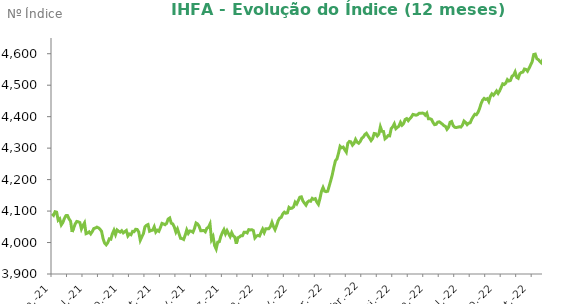
| Category | Series 0 |
|---|---|
| 2021-06-30 | 4091.19 |
| 2021-07-01 | 4086.52 |
| 2021-07-02 | 4097.86 |
| 2021-07-05 | 4096.51 |
| 2021-07-06 | 4070.87 |
| 2021-07-07 | 4075.44 |
| 2021-07-08 | 4056.16 |
| 2021-07-09 | 4063.56 |
| 2021-07-12 | 4076.5 |
| 2021-07-13 | 4085.56 |
| 2021-07-14 | 4085.78 |
| 2021-07-15 | 4075.11 |
| 2021-07-16 | 4067.77 |
| 2021-07-19 | 4033.75 |
| 2021-07-20 | 4046.31 |
| 2021-07-21 | 4059.3 |
| 2021-07-22 | 4066.98 |
| 2021-07-23 | 4065.91 |
| 2021-07-26 | 4063.49 |
| 2021-07-27 | 4043.27 |
| 2021-07-28 | 4054.41 |
| 2021-07-29 | 4062.71 |
| 2021-07-30 | 4028.14 |
| 2021-08-02 | 4030.13 |
| 2021-08-03 | 4033.93 |
| 2021-08-04 | 4027.52 |
| 2021-08-05 | 4034.98 |
| 2021-08-06 | 4044.43 |
| 2021-08-09 | 4046.2 |
| 2021-08-10 | 4048.89 |
| 2021-08-11 | 4046.7 |
| 2021-08-12 | 4042.07 |
| 2021-08-13 | 4035.54 |
| 2021-08-16 | 4012.2 |
| 2021-08-17 | 3997.84 |
| 2021-08-18 | 3992.73 |
| 2021-08-19 | 3999.27 |
| 2021-08-20 | 4011.78 |
| 2021-08-23 | 4010.67 |
| 2021-08-24 | 4028.05 |
| 2021-08-25 | 4039.1 |
| 2021-08-26 | 4025.41 |
| 2021-08-27 | 4040.01 |
| 2021-08-30 | 4035.92 |
| 2021-08-31 | 4033.08 |
| 2021-09-01 | 4037.66 |
| 2021-09-02 | 4030.79 |
| 2021-09-03 | 4034.61 |
| 2021-09-06 | 4038.27 |
| 2021-09-08 | 4020.87 |
| 2021-09-09 | 4027.15 |
| 2021-09-10 | 4024.8 |
| 2021-09-13 | 4035.39 |
| 2021-09-14 | 4034.54 |
| 2021-09-15 | 4042.17 |
| 2021-09-16 | 4041.49 |
| 2021-09-17 | 4033.61 |
| 2021-09-20 | 4007.25 |
| 2021-09-21 | 4018.04 |
| 2021-09-22 | 4027.91 |
| 2021-09-23 | 4049.69 |
| 2021-09-24 | 4054.89 |
| 2021-09-27 | 4057.13 |
| 2021-09-28 | 4035.95 |
| 2021-09-29 | 4038.34 |
| 2021-09-30 | 4039.3 |
| 2021-10-01 | 4050.05 |
| 2021-10-04 | 4033.15 |
| 2021-10-05 | 4038.94 |
| 2021-10-06 | 4035.78 |
| 2021-10-07 | 4047.57 |
| 2021-10-08 | 4060.84 |
| 2021-10-11 | 4059.07 |
| 2021-10-13 | 4056.52 |
| 2021-10-14 | 4061.11 |
| 2021-10-15 | 4074.77 |
| 2021-10-18 | 4078.05 |
| 2021-10-19 | 4061.42 |
| 2021-10-20 | 4059.05 |
| 2021-10-21 | 4048.86 |
| 2021-10-22 | 4033.16 |
| 2021-10-25 | 4043.06 |
| 2021-10-26 | 4027.86 |
| 2021-10-27 | 4013.41 |
| 2021-10-28 | 4012.41 |
| 2021-10-29 | 4009.78 |
| 2021-11-01 | 4023.42 |
| 2021-11-03 | 4040.16 |
| 2021-11-04 | 4029.18 |
| 2021-11-05 | 4036.69 |
| 2021-11-08 | 4035.95 |
| 2021-11-09 | 4032.66 |
| 2021-11-10 | 4045.02 |
| 2021-11-11 | 4062.03 |
| 2021-11-12 | 4059.02 |
| 2021-11-16 | 4051.69 |
| 2021-11-17 | 4037.47 |
| 2021-11-18 | 4037.78 |
| 2021-11-19 | 4038.26 |
| 2021-11-22 | 4034.06 |
| 2021-11-23 | 4045.6 |
| 2021-11-24 | 4048.5 |
| 2021-11-25 | 4058.96 |
| 2021-11-26 | 4008.94 |
| 2021-11-29 | 4018.61 |
| 2021-11-30 | 3990.07 |
| 2021-12-01 | 3979.51 |
| 2021-12-02 | 4001.4 |
| 2021-12-03 | 4002.43 |
| 2021-12-06 | 4019.49 |
| 2021-12-07 | 4031.65 |
| 2021-12-08 | 4040.97 |
| 2021-12-09 | 4027.29 |
| 2021-12-10 | 4037.68 |
| 2021-12-13 | 4028.23 |
| 2021-12-14 | 4019.14 |
| 2021-12-15 | 4031.45 |
| 2021-12-16 | 4021.15 |
| 2021-12-17 | 4017.55 |
| 2021-12-20 | 3996.12 |
| 2021-12-21 | 4015.29 |
| 2021-12-22 | 4017.47 |
| 2021-12-23 | 4021.73 |
| 2021-12-24 | 4021.88 |
| 2021-12-27 | 4032.68 |
| 2021-12-28 | 4032.76 |
| 2021-12-29 | 4030.47 |
| 2021-12-30 | 4040.91 |
| 2021-12-31 | 4040.03 |
| 2022-01-03 | 4040.78 |
| 2022-01-04 | 4038.01 |
| 2022-01-05 | 4014.68 |
| 2022-01-06 | 4020.43 |
| 2022-01-07 | 4022.59 |
| 2022-01-10 | 4020.86 |
| 2022-01-11 | 4032.64 |
| 2022-01-12 | 4042.77 |
| 2022-01-13 | 4031.63 |
| 2022-01-14 | 4043.7 |
| 2022-01-17 | 4044.11 |
| 2022-01-18 | 4044.11 |
| 2022-01-19 | 4050.58 |
| 2022-01-20 | 4064.28 |
| 2022-01-21 | 4050.45 |
| 2022-01-24 | 4040.88 |
| 2022-01-25 | 4053.68 |
| 2022-01-26 | 4069.02 |
| 2022-01-27 | 4077.83 |
| 2022-01-28 | 4080.12 |
| 2022-01-31 | 4091 |
| 2022-02-01 | 4096.58 |
| 2022-02-02 | 4092.98 |
| 2022-02-03 | 4094.44 |
| 2022-02-04 | 4111.68 |
| 2022-02-07 | 4108.1 |
| 2022-02-08 | 4109.29 |
| 2022-02-09 | 4113.45 |
| 2022-02-10 | 4128.21 |
| 2022-02-11 | 4122.64 |
| 2022-02-14 | 4133.21 |
| 2022-02-15 | 4144.05 |
| 2022-02-16 | 4145.22 |
| 2022-02-17 | 4132.01 |
| 2022-02-18 | 4125.03 |
| 2022-02-21 | 4118.77 |
| 2022-02-22 | 4128.67 |
| 2022-02-23 | 4132.58 |
| 2022-02-24 | 4131.29 |
| 2022-02-25 | 4140.33 |
| 2022-03-02 | 4137.29 |
| 2022-03-03 | 4139.42 |
| 2022-03-04 | 4128.34 |
| 2022-03-07 | 4121.36 |
| 2022-03-08 | 4139.88 |
| 2022-03-09 | 4163.01 |
| 2022-03-10 | 4174.94 |
| 2022-03-11 | 4163.25 |
| 2022-03-14 | 4161.62 |
| 2022-03-15 | 4163.17 |
| 2022-03-16 | 4180.27 |
| 2022-03-17 | 4197.38 |
| 2022-03-18 | 4216.15 |
| 2022-03-21 | 4239.96 |
| 2022-03-22 | 4259.92 |
| 2022-03-23 | 4266.14 |
| 2022-03-24 | 4284.17 |
| 2022-03-25 | 4306.04 |
| 2022-03-28 | 4301.17 |
| 2022-03-29 | 4303.43 |
| 2022-03-30 | 4294.86 |
| 2022-03-31 | 4287.32 |
| 2022-04-01 | 4315.72 |
| 2022-04-04 | 4321.24 |
| 2022-04-05 | 4319.86 |
| 2022-04-06 | 4309.53 |
| 2022-04-07 | 4315.01 |
| 2022-04-08 | 4327.76 |
| 2022-04-11 | 4318.84 |
| 2022-04-12 | 4315.58 |
| 2022-04-13 | 4320.88 |
| 2022-04-14 | 4331.49 |
| 2022-04-18 | 4335.14 |
| 2022-04-19 | 4343.38 |
| 2022-04-20 | 4347.19 |
| 2022-04-22 | 4339.14 |
| 2022-04-25 | 4332.06 |
| 2022-04-26 | 4324.09 |
| 2022-04-27 | 4330.61 |
| 2022-04-28 | 4346.48 |
| 2022-04-29 | 4345.76 |
| 2022-05-02 | 4338.55 |
| 2022-05-03 | 4344.23 |
| 2022-05-04 | 4367.72 |
| 2022-05-05 | 4353.47 |
| 2022-05-06 | 4353.09 |
| 2022-05-09 | 4329.81 |
| 2022-05-10 | 4333.87 |
| 2022-05-11 | 4339.92 |
| 2022-05-12 | 4339.02 |
| 2022-05-13 | 4362.08 |
| 2022-05-16 | 4367.99 |
| 2022-05-17 | 4377.25 |
| 2022-05-18 | 4361.85 |
| 2022-05-19 | 4365.84 |
| 2022-05-20 | 4370.28 |
| 2022-05-23 | 4381.87 |
| 2022-05-24 | 4372.9 |
| 2022-05-25 | 4378.21 |
| 2022-05-26 | 4391.18 |
| 2022-05-27 | 4393.81 |
| 2022-05-30 | 4387.34 |
| 2022-05-31 | 4393.69 |
| 2022-06-01 | 4398.86 |
| 2022-06-02 | 4407.08 |
| 2022-06-03 | 4405.95 |
| 2022-06-06 | 4404.67 |
| 2022-06-07 | 4406.15 |
| 2022-06-08 | 4410.66 |
| 2022-06-09 | 4410.74 |
| 2022-06-10 | 4411.45 |
| 2022-06-13 | 4410.41 |
| 2022-06-14 | 4404.92 |
| 2022-06-15 | 4411.04 |
| 2022-06-17 | 4393.67 |
| 2022-06-20 | 4393.54 |
| 2022-06-21 | 4391.22 |
| 2022-06-22 | 4381.46 |
| 2022-06-23 | 4374.66 |
| 2022-06-24 | 4375.66 |
| 2022-06-27 | 4382.52 |
| 2022-06-28 | 4383.74 |
| 2022-06-29 | 4380.23 |
| 2022-06-30 | 4376.35 |
| 2022-07-01 | 4371.48 |
| 2022-07-04 | 4369.29 |
| 2022-07-05 | 4359.8 |
| 2022-07-06 | 4366.05 |
| 2022-07-07 | 4382.22 |
| 2022-07-08 | 4384.67 |
| 2022-07-11 | 4371.58 |
| 2022-07-12 | 4366.28 |
| 2022-07-13 | 4365.61 |
| 2022-07-14 | 4366.5 |
| 2022-07-15 | 4367.93 |
| 2022-07-18 | 4366.96 |
| 2022-07-19 | 4373.3 |
| 2022-07-20 | 4386.03 |
| 2022-07-21 | 4381.88 |
| 2022-07-22 | 4374.72 |
| 2022-07-25 | 4379.24 |
| 2022-07-26 | 4380.54 |
| 2022-07-27 | 4392.11 |
| 2022-07-28 | 4400.37 |
| 2022-07-29 | 4407.82 |
| 2022-08-01 | 4406.25 |
| 2022-08-02 | 4413.4 |
| 2022-08-03 | 4425.11 |
| 2022-08-04 | 4441.09 |
| 2022-08-05 | 4452.15 |
| 2022-08-08 | 4458.07 |
| 2022-08-09 | 4454.98 |
| 2022-08-10 | 4457.25 |
| 2022-08-11 | 4448.2 |
| 2022-08-12 | 4464.61 |
| 2022-08-15 | 4472.71 |
| 2022-08-16 | 4468.06 |
| 2022-08-17 | 4474.57 |
| 2022-08-18 | 4481.68 |
| 2022-08-19 | 4473.97 |
| 2022-08-22 | 4482.05 |
| 2022-08-23 | 4493.21 |
| 2022-08-24 | 4504.37 |
| 2022-08-25 | 4502.13 |
| 2022-08-26 | 4506.75 |
| 2022-08-29 | 4517.73 |
| 2022-08-30 | 4513.24 |
| 2022-08-31 | 4515.16 |
| 2022-09-01 | 4528.52 |
| 2022-09-02 | 4531.67 |
| 2022-09-05 | 4542.15 |
| 2022-09-06 | 4525.11 |
| 2022-09-08 | 4521.96 |
| 2022-09-09 | 4536.39 |
| 2022-09-12 | 4540.42 |
| 2022-09-13 | 4541.69 |
| 2022-09-14 | 4551.4 |
| 2022-09-15 | 4550.25 |
| 2022-09-16 | 4544.65 |
| 2022-09-19 | 4553.97 |
| 2022-09-20 | 4564.09 |
| 2022-09-21 | 4574.43 |
| 2022-09-22 | 4597.61 |
| 2022-09-23 | 4598.77 |
| 2022-09-26 | 4584.44 |
| 2022-09-27 | 4581.13 |
| 2022-09-28 | 4575.78 |
| 2022-09-29 | 4571.03 |
| 2022-09-30 | 4582.61 |